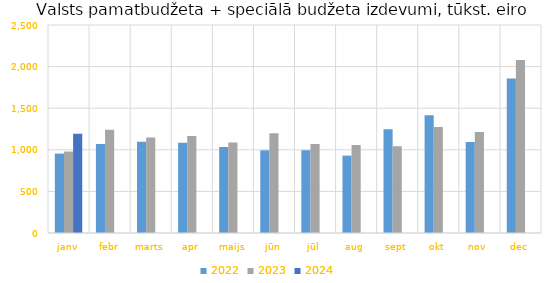
| Category | 2022 | 2023 | 2024 |
|---|---|---|---|
| janv | 954604.585 | 979490.845 | 1193977.049 |
| febr | 1070533.109 | 1241845.152 | 0 |
| marts | 1096177.665 | 1147758.348 | 0 |
| apr | 1085060.388 | 1165647.249 | 0 |
| maijs | 1032376.247 | 1086477.037 | 0 |
| jūn | 994027.105 | 1200332.508 | 0 |
| jūl | 994781.699 | 1069038.771 | 0 |
| aug | 929865.805 | 1059055.24 | 0 |
| sept | 1247630.19 | 1042251.968 | 0 |
| okt | 1415572.01 | 1274735.47 | 0 |
| nov | 1092974.61 | 1214492.205 | 0 |
| dec | 1857192.044 | 2078569.315 | 0 |